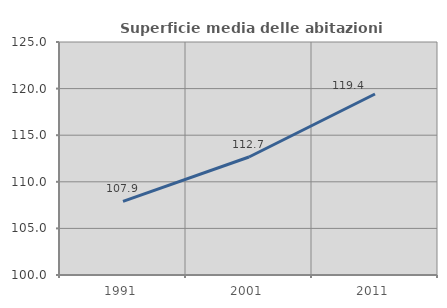
| Category | Superficie media delle abitazioni occupate |
|---|---|
| 1991.0 | 107.908 |
| 2001.0 | 112.663 |
| 2011.0 | 119.421 |